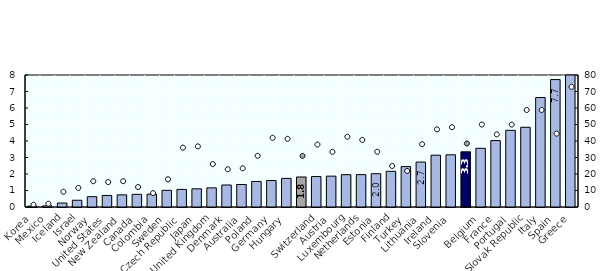
| Category | Long-term unemployment rate (left scale) |
|---|---|
| Korea | 0.053 |
| Mexico | 0.067 |
| Iceland | 0.24 |
| Israel | 0.41 |
| Norway | 0.626 |
| United States | 0.7 |
| New Zealand | 0.736 |
| Canada | 0.768 |
| Colombia | 0.778 |
| Sweden | 1.011 |
| Czech Republic | 1.066 |
| Japan | 1.102 |
| United Kingdom | 1.161 |
| Denmark | 1.334 |
| Australia | 1.364 |
| Poland | 1.548 |
| Germany | 1.605 |
| Hungary | 1.735 |
|  | 1.819 |
| Switzerland | 1.845 |
| Austria | 1.869 |
| Luxembourg | 1.958 |
| Netherlands | 1.962 |
| Estonia | 2.019 |
| Finland | 2.164 |
| Turkey | 2.449 |
| Lithuania | 2.723 |
| Ireland | 3.141 |
| Slovenia | 3.163 |
|  | 3.345 |
| Belgium | 3.558 |
| France | 4.025 |
| Portugal | 4.646 |
| Slovak Republic | 4.832 |
| Italy | 6.636 |
| Spain | 7.723 |
| Greece | 8 |